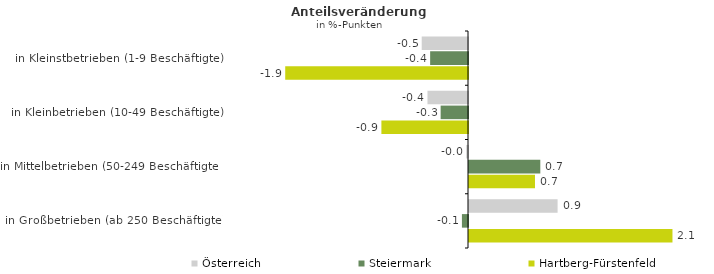
| Category | Österreich | Steiermark | Hartberg-Fürstenfeld |
|---|---|---|---|
| in Kleinstbetrieben (1-9 Beschäftigte) | -0.48 | -0.393 | -1.896 |
| in Kleinbetrieben (10-49 Beschäftigte) | -0.42 | -0.284 | -0.898 |
| in Mittelbetrieben (50-249 Beschäftigte) | -0.019 | 0.74 | 0.685 |
| in Großbetrieben (ab 250 Beschäftigte) | 0.919 | -0.063 | 2.111 |